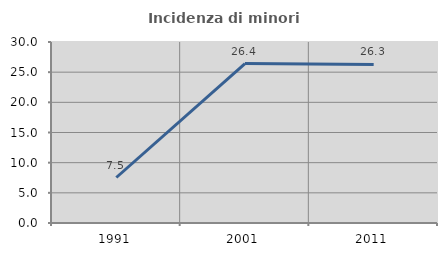
| Category | Incidenza di minori stranieri |
|---|---|
| 1991.0 | 7.541 |
| 2001.0 | 26.43 |
| 2011.0 | 26.279 |